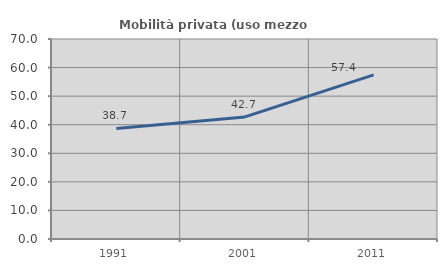
| Category | Mobilità privata (uso mezzo privato) |
|---|---|
| 1991.0 | 38.702 |
| 2001.0 | 42.718 |
| 2011.0 | 57.437 |